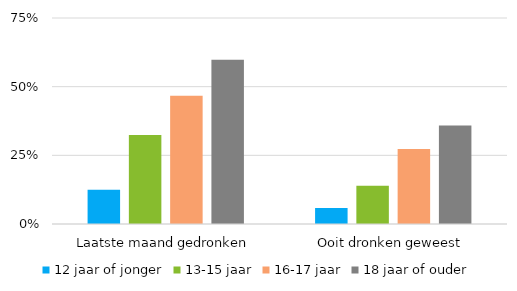
| Category | 12 jaar of jonger | 13-15 jaar | 16-17 jaar | 18 jaar of ouder |
|---|---|---|---|---|
| Laatste maand gedronken | 0.125 | 0.324 | 0.467 | 0.598 |
| Ooit dronken geweest | 0.058 | 0.139 | 0.273 | 0.359 |